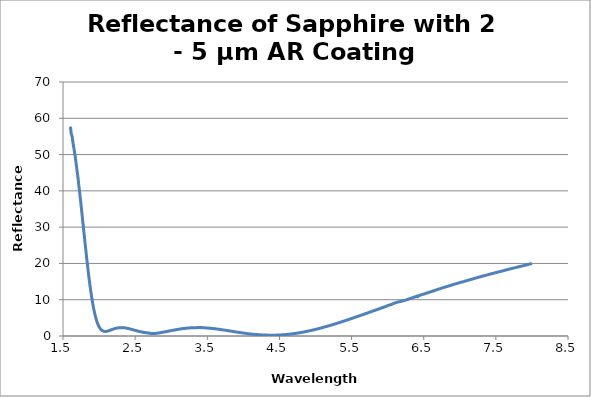
| Category | Wavelength (µm) |
|---|---|
| 1.59996 | 56.909 |
| 1.60243 | 57.18 |
| 1.6049 | 57.358 |
| 1.60737 | 57.055 |
| 1.6098299999999999 | 56.45 |
| 1.6122999999999998 | 55.977 |
| 1.61477 | 55.744 |
| 1.61724 | 55.648 |
| 1.61971 | 55.459 |
| 1.62218 | 55.185 |
| 1.6246500000000001 | 55.079 |
| 1.62712 | 54.979 |
| 1.6295899999999999 | 54.58 |
| 1.6320599999999998 | 54.035 |
| 1.63453 | 53.771 |
| 1.63699 | 53.499 |
| 1.6394600000000001 | 53.002 |
| 1.6419300000000001 | 52.737 |
| 1.6444 | 52.586 |
| 1.6468699999999998 | 52.194 |
| 1.64934 | 51.9 |
| 1.65181 | 51.78 |
| 1.65428 | 51.38 |
| 1.65675 | 51.048 |
| 1.65922 | 50.906 |
| 1.6616900000000001 | 50.435 |
| 1.66415 | 50.188 |
| 1.66662 | 49.839 |
| 1.66909 | 49.418 |
| 1.67156 | 49.194 |
| 1.67403 | 48.727 |
| 1.6765 | 48.442 |
| 1.67897 | 48.013 |
| 1.68144 | 47.566 |
| 1.68391 | 47.272 |
| 1.6863800000000002 | 46.767 |
| 1.68884 | 46.502 |
| 1.6913099999999999 | 45.95 |
| 1.69378 | 45.726 |
| 1.69625 | 45.232 |
| 1.69872 | 45.006 |
| 1.70119 | 44.568 |
| 1.7036600000000002 | 44.301 |
| 1.7061300000000001 | 43.843 |
| 1.7086 | 43.573 |
| 1.7110699999999999 | 42.997 |
| 1.71354 | 42.644 |
| 1.716 | 42.054 |
| 1.71847 | 41.696 |
| 1.7209400000000001 | 41.182 |
| 1.72341 | 40.89 |
| 1.72588 | 40.471 |
| 1.7283499999999998 | 40.095 |
| 1.73082 | 39.685 |
| 1.73329 | 39.126 |
| 1.73576 | 38.678 |
| 1.73823 | 38.157 |
| 1.7407000000000001 | 37.833 |
| 1.74316 | 37.442 |
| 1.74563 | 36.934 |
| 1.7481 | 36.497 |
| 1.75057 | 35.933 |
| 1.75304 | 35.502 |
| 1.75551 | 35.172 |
| 1.75798 | 34.663 |
| 1.76045 | 34.178 |
| 1.76292 | 33.683 |
| 1.76539 | 33.201 |
| 1.76786 | 32.811 |
| 1.77032 | 32.396 |
| 1.7727899999999999 | 31.805 |
| 1.77526 | 31.309 |
| 1.77773 | 30.978 |
| 1.7802 | 30.513 |
| 1.78267 | 29.933 |
| 1.7851400000000002 | 29.462 |
| 1.78761 | 29.068 |
| 1.79008 | 28.577 |
| 1.7925499999999999 | 28.061 |
| 1.79502 | 27.624 |
| 1.79748 | 27.235 |
| 1.79995 | 26.712 |
| 1.8024200000000001 | 26.183 |
| 1.80489 | 25.8 |
| 1.8073599999999999 | 25.354 |
| 1.8098299999999998 | 24.832 |
| 1.8123 | 24.385 |
| 1.81477 | 23.976 |
| 1.81724 | 23.485 |
| 1.81971 | 23.043 |
| 1.82217 | 22.636 |
| 1.82464 | 22.124 |
| 1.8271099999999998 | 21.599 |
| 1.82958 | 21.287 |
| 1.83205 | 20.795 |
| 1.83452 | 20.397 |
| 1.83699 | 19.951 |
| 1.83946 | 19.517 |
| 1.84193 | 19.106 |
| 1.8444 | 18.674 |
| 1.8468699999999998 | 18.252 |
| 1.84933 | 17.825 |
| 1.8518 | 17.454 |
| 1.85427 | 17.018 |
| 1.85674 | 16.674 |
| 1.85921 | 16.225 |
| 1.86168 | 15.824 |
| 1.8641500000000002 | 15.446 |
| 1.86662 | 15.011 |
| 1.86909 | 14.682 |
| 1.87156 | 14.287 |
| 1.8740299999999999 | 13.883 |
| 1.87649 | 13.599 |
| 1.87896 | 13.229 |
| 1.8814300000000002 | 12.883 |
| 1.8839000000000001 | 12.53 |
| 1.8863699999999999 | 12.196 |
| 1.8888399999999999 | 11.837 |
| 1.89131 | 11.502 |
| 1.89378 | 11.192 |
| 1.89625 | 10.864 |
| 1.89872 | 10.563 |
| 1.9011900000000002 | 10.237 |
| 1.90365 | 9.935 |
| 1.9061199999999998 | 9.638 |
| 1.90859 | 9.37 |
| 1.91106 | 9.069 |
| 1.91353 | 8.833 |
| 1.916 | 8.507 |
| 1.9184700000000001 | 8.26 |
| 1.92094 | 7.971 |
| 1.92341 | 7.751 |
| 1.92588 | 7.472 |
| 1.92834 | 7.259 |
| 1.93081 | 7.004 |
| 1.9332799999999999 | 6.778 |
| 1.93575 | 6.548 |
| 1.93822 | 6.343 |
| 1.94069 | 6.101 |
| 1.94316 | 5.903 |
| 1.9456300000000002 | 5.703 |
| 1.9481 | 5.5 |
| 1.95057 | 5.309 |
| 1.9530399999999999 | 5.127 |
| 1.9555 | 4.948 |
| 1.95797 | 4.775 |
| 1.96044 | 4.62 |
| 1.9629100000000002 | 4.44 |
| 1.9653800000000001 | 4.279 |
| 1.9678499999999999 | 4.135 |
| 1.9703199999999998 | 3.98 |
| 1.97279 | 3.84 |
| 1.97526 | 3.684 |
| 1.97773 | 3.566 |
| 1.9802 | 3.423 |
| 1.98266 | 3.324 |
| 1.98513 | 3.182 |
| 1.9875999999999998 | 3.082 |
| 1.99007 | 2.959 |
| 1.99254 | 2.856 |
| 1.99501 | 2.762 |
| 1.99748 | 2.662 |
| 1.9999500000000001 | 2.551 |
| 2.00242 | 2.482 |
| 2.00489 | 2.39 |
| 2.00736 | 2.306 |
| 2.00982 | 2.231 |
| 2.01229 | 2.171 |
| 2.01476 | 2.097 |
| 2.01723 | 2.026 |
| 2.0197 | 1.958 |
| 2.02217 | 1.907 |
| 2.02464 | 1.838 |
| 2.02711 | 1.792 |
| 2.0295799999999997 | 1.734 |
| 2.03205 | 1.692 |
| 2.03452 | 1.642 |
| 2.0369800000000002 | 1.598 |
| 2.03945 | 1.572 |
| 2.04192 | 1.519 |
| 2.04439 | 1.502 |
| 2.0468599999999997 | 1.459 |
| 2.04933 | 1.432 |
| 2.0518 | 1.416 |
| 2.05427 | 1.383 |
| 2.0567399999999996 | 1.372 |
| 2.05921 | 1.341 |
| 2.06167 | 1.327 |
| 2.06414 | 1.31 |
| 2.0666100000000003 | 1.302 |
| 2.06908 | 1.284 |
| 2.0715500000000002 | 1.282 |
| 2.07402 | 1.276 |
| 2.0764899999999997 | 1.265 |
| 2.07896 | 1.262 |
| 2.0814299999999997 | 1.261 |
| 2.0839000000000003 | 1.251 |
| 2.08637 | 1.259 |
| 2.0888299999999997 | 1.258 |
| 2.0913000000000004 | 1.264 |
| 2.09377 | 1.27 |
| 2.09624 | 1.265 |
| 2.09871 | 1.273 |
| 2.10118 | 1.286 |
| 2.10365 | 1.296 |
| 2.1061199999999998 | 1.297 |
| 2.10859 | 1.315 |
| 2.11106 | 1.314 |
| 2.1135300000000004 | 1.323 |
| 2.1159899999999996 | 1.343 |
| 2.1184600000000002 | 1.353 |
| 2.12093 | 1.367 |
| 2.1234 | 1.383 |
| 2.12587 | 1.398 |
| 2.12834 | 1.409 |
| 2.13081 | 1.424 |
| 2.13328 | 1.451 |
| 2.13575 | 1.462 |
| 2.13822 | 1.482 |
| 2.14069 | 1.488 |
| 2.14315 | 1.503 |
| 2.14562 | 1.527 |
| 2.1480900000000003 | 1.536 |
| 2.15056 | 1.559 |
| 2.15303 | 1.576 |
| 2.1555 | 1.592 |
| 2.1579699999999997 | 1.624 |
| 2.16044 | 1.646 |
| 2.1629099999999997 | 1.651 |
| 2.1653800000000003 | 1.66 |
| 2.16784 | 1.683 |
| 2.1703099999999997 | 1.709 |
| 2.1727800000000004 | 1.726 |
| 2.17525 | 1.74 |
| 2.17772 | 1.767 |
| 2.18019 | 1.778 |
| 2.18266 | 1.793 |
| 2.18513 | 1.821 |
| 2.1875999999999998 | 1.833 |
| 2.19007 | 1.852 |
| 2.19254 | 1.869 |
| 2.195 | 1.892 |
| 2.1974699999999996 | 1.893 |
| 2.1999400000000002 | 1.915 |
| 2.20241 | 1.931 |
| 2.20488 | 1.95 |
| 2.20735 | 1.974 |
| 2.20982 | 1.989 |
| 2.21229 | 1.999 |
| 2.21476 | 2.012 |
| 2.21723 | 2.028 |
| 2.2197 | 2.045 |
| 2.2221599999999997 | 2.059 |
| 2.2246300000000003 | 2.061 |
| 2.2271 | 2.085 |
| 2.2295700000000003 | 2.099 |
| 2.23204 | 2.109 |
| 2.23451 | 2.123 |
| 2.23698 | 2.137 |
| 2.2394499999999997 | 2.149 |
| 2.24192 | 2.168 |
| 2.2443899999999997 | 2.178 |
| 2.2468600000000003 | 2.177 |
| 2.24932 | 2.191 |
| 2.25179 | 2.2 |
| 2.2542600000000004 | 2.205 |
| 2.25673 | 2.219 |
| 2.2592 | 2.226 |
| 2.26167 | 2.237 |
| 2.26414 | 2.234 |
| 2.26661 | 2.251 |
| 2.2690799999999998 | 2.248 |
| 2.2715500000000004 | 2.27 |
| 2.27401 | 2.267 |
| 2.27648 | 2.281 |
| 2.27895 | 2.287 |
| 2.2814200000000002 | 2.28 |
| 2.28389 | 2.281 |
| 2.28636 | 2.296 |
| 2.28883 | 2.302 |
| 2.2913 | 2.301 |
| 2.29377 | 2.298 |
| 2.2962399999999996 | 2.299 |
| 2.2987100000000003 | 2.302 |
| 2.30117 | 2.304 |
| 2.3036399999999997 | 2.308 |
| 2.3061100000000003 | 2.309 |
| 2.30858 | 2.304 |
| 2.3110500000000003 | 2.308 |
| 2.31352 | 2.309 |
| 2.3159899999999998 | 2.302 |
| 2.31846 | 2.303 |
| 2.3209299999999997 | 2.301 |
| 2.3234 | 2.298 |
| 2.32587 | 2.302 |
| 2.32833 | 2.285 |
| 2.3308 | 2.305 |
| 2.33327 | 2.291 |
| 2.33574 | 2.284 |
| 2.33821 | 2.28 |
| 2.34068 | 2.275 |
| 2.34315 | 2.271 |
| 2.34562 | 2.261 |
| 2.34809 | 2.264 |
| 2.3505599999999998 | 2.256 |
| 2.3530300000000004 | 2.246 |
| 2.3554899999999996 | 2.247 |
| 2.35796 | 2.233 |
| 2.36043 | 2.222 |
| 2.3629000000000002 | 2.208 |
| 2.36537 | 2.211 |
| 2.36784 | 2.2 |
| 2.37031 | 2.199 |
| 2.37278 | 2.19 |
| 2.37525 | 2.182 |
| 2.3777199999999996 | 2.168 |
| 2.3801900000000002 | 2.16 |
| 2.38265 | 2.152 |
| 2.3851199999999997 | 2.146 |
| 2.3875900000000003 | 2.127 |
| 2.39006 | 2.125 |
| 2.3925300000000003 | 2.105 |
| 2.395 | 2.1 |
| 2.3974699999999998 | 2.092 |
| 2.39994 | 2.077 |
| 2.4024099999999997 | 2.078 |
| 2.40488 | 2.053 |
| 2.40734 | 2.051 |
| 2.40981 | 2.039 |
| 2.41228 | 2.025 |
| 2.41475 | 2.012 |
| 2.41722 | 2 |
| 2.41969 | 1.986 |
| 2.42216 | 1.98 |
| 2.42463 | 1.958 |
| 2.4271 | 1.951 |
| 2.42957 | 1.938 |
| 2.4320399999999998 | 1.926 |
| 2.4345 | 1.904 |
| 2.4369699999999996 | 1.898 |
| 2.4394400000000003 | 1.883 |
| 2.44191 | 1.873 |
| 2.44438 | 1.859 |
| 2.44685 | 1.846 |
| 2.44932 | 1.839 |
| 2.45179 | 1.822 |
| 2.45426 | 1.804 |
| 2.45673 | 1.795 |
| 2.4591999999999996 | 1.77 |
| 2.4616599999999997 | 1.765 |
| 2.46413 | 1.751 |
| 2.4666 | 1.731 |
| 2.4690700000000003 | 1.723 |
| 2.47154 | 1.71 |
| 2.4740100000000003 | 1.692 |
| 2.47648 | 1.678 |
| 2.4789499999999998 | 1.666 |
| 2.48142 | 1.653 |
| 2.4838899999999997 | 1.637 |
| 2.4863600000000003 | 1.622 |
| 2.48882 | 1.613 |
| 2.49129 | 1.6 |
| 2.4937600000000004 | 1.589 |
| 2.49623 | 1.573 |
| 2.4987 | 1.55 |
| 2.50117 | 1.545 |
| 2.50364 | 1.526 |
| 2.50611 | 1.518 |
| 2.50858 | 1.508 |
| 2.51105 | 1.494 |
| 2.51351 | 1.468 |
| 2.51598 | 1.468 |
| 2.5184499999999996 | 1.445 |
| 2.5209200000000003 | 1.438 |
| 2.52339 | 1.429 |
| 2.52586 | 1.419 |
| 2.52833 | 1.402 |
| 2.5308 | 1.379 |
| 2.53327 | 1.372 |
| 2.5357399999999997 | 1.365 |
| 2.53821 | 1.344 |
| 2.54067 | 1.329 |
| 2.5431399999999997 | 1.333 |
| 2.54561 | 1.306 |
| 2.54808 | 1.294 |
| 2.5505500000000003 | 1.295 |
| 2.55302 | 1.273 |
| 2.55549 | 1.254 |
| 2.55796 | 1.245 |
| 2.5604299999999998 | 1.253 |
| 2.5629 | 1.227 |
| 2.5653699999999997 | 1.208 |
| 2.56783 | 1.207 |
| 2.5703 | 1.195 |
| 2.57277 | 1.193 |
| 2.57524 | 1.159 |
| 2.57771 | 1.166 |
| 2.58018 | 1.159 |
| 2.58265 | 1.136 |
| 2.58512 | 1.108 |
| 2.58759 | 1.127 |
| 2.59006 | 1.104 |
| 2.59253 | 1.109 |
| 2.5949899999999997 | 1.116 |
| 2.59746 | 1.064 |
| 2.5999299999999996 | 1.065 |
| 2.6024000000000003 | 1.064 |
| 2.60487 | 1.065 |
| 2.60734 | 1.023 |
| 2.60981 | 1.038 |
| 2.61228 | 1.02 |
| 2.61475 | 1.006 |
| 2.6172199999999997 | 1.006 |
| 2.61969 | 1.017 |
| 2.62215 | 0.97 |
| 2.6246199999999997 | 0.982 |
| 2.62709 | 0.995 |
| 2.62956 | 1 |
| 2.6320300000000003 | 0.94 |
| 2.6345 | 0.948 |
| 2.63697 | 0.944 |
| 2.63944 | 0.941 |
| 2.6419099999999998 | 0.944 |
| 2.64438 | 0.928 |
| 2.64684 | 0.904 |
| 2.64931 | 0.914 |
| 2.65178 | 0.914 |
| 2.65425 | 0.887 |
| 2.65672 | 0.886 |
| 2.65919 | 0.908 |
| 2.66166 | 0.874 |
| 2.66413 | 0.88 |
| 2.6666 | 0.883 |
| 2.66907 | 0.865 |
| 2.67154 | 0.824 |
| 2.674 | 0.847 |
| 2.6764699999999997 | 0.85 |
| 2.67894 | 0.816 |
| 2.68141 | 0.812 |
| 2.6838800000000003 | 0.828 |
| 2.68635 | 0.817 |
| 2.68882 | 0.797 |
| 2.69129 | 0.796 |
| 2.69376 | 0.809 |
| 2.69623 | 0.763 |
| 2.6986999999999997 | 0.763 |
| 2.70116 | 0.76 |
| 2.70363 | 0.744 |
| 2.7060999999999997 | 0.744 |
| 2.7085700000000004 | 0.746 |
| 2.71104 | 0.735 |
| 2.7135100000000003 | 0.719 |
| 2.71598 | 0.716 |
| 2.71845 | 0.714 |
| 2.72092 | 0.719 |
| 2.7233899999999998 | 0.707 |
| 2.72586 | 0.697 |
| 2.72832 | 0.693 |
| 2.73079 | 0.704 |
| 2.73326 | 0.697 |
| 2.73573 | 0.684 |
| 2.7382 | 0.698 |
| 2.74067 | 0.68 |
| 2.74314 | 0.679 |
| 2.74561 | 0.687 |
| 2.74808 | 0.678 |
| 2.75055 | 0.681 |
| 2.75301 | 0.679 |
| 2.75548 | 0.698 |
| 2.7579499999999997 | 0.68 |
| 2.76042 | 0.689 |
| 2.76289 | 0.698 |
| 2.7653600000000003 | 0.695 |
| 2.76783 | 0.7 |
| 2.7703 | 0.703 |
| 2.77277 | 0.699 |
| 2.7752399999999997 | 0.702 |
| 2.77771 | 0.705 |
| 2.78017 | 0.721 |
| 2.78264 | 0.718 |
| 2.78511 | 0.727 |
| 2.7875799999999997 | 0.735 |
| 2.7900500000000004 | 0.733 |
| 2.79252 | 0.736 |
| 2.79499 | 0.747 |
| 2.79746 | 0.75 |
| 2.79993 | 0.758 |
| 2.8024 | 0.77 |
| 2.8048699999999998 | 0.767 |
| 2.80733 | 0.784 |
| 2.8098 | 0.781 |
| 2.81227 | 0.788 |
| 2.8147399999999996 | 0.797 |
| 2.81721 | 0.8 |
| 2.81968 | 0.814 |
| 2.82215 | 0.816 |
| 2.82462 | 0.827 |
| 2.82709 | 0.83 |
| 2.82956 | 0.842 |
| 2.83203 | 0.846 |
| 2.8344899999999997 | 0.85 |
| 2.83696 | 0.871 |
| 2.8394299999999997 | 0.878 |
| 2.8419 | 0.878 |
| 2.84437 | 0.899 |
| 2.8468400000000003 | 0.902 |
| 2.84931 | 0.905 |
| 2.85178 | 0.919 |
| 2.85425 | 0.931 |
| 2.8567199999999997 | 0.936 |
| 2.85918 | 0.939 |
| 2.86165 | 0.96 |
| 2.8641199999999998 | 0.959 |
| 2.86659 | 0.975 |
| 2.86906 | 0.975 |
| 2.8715300000000004 | 0.985 |
| 2.874 | 0.993 |
| 2.87647 | 1.009 |
| 2.87894 | 1.018 |
| 2.88141 | 1.023 |
| 2.88388 | 1.041 |
| 2.88634 | 1.036 |
| 2.88881 | 1.048 |
| 2.89128 | 1.065 |
| 2.89375 | 1.07 |
| 2.89622 | 1.079 |
| 2.89869 | 1.085 |
| 2.90116 | 1.091 |
| 2.90363 | 1.095 |
| 2.9061 | 1.123 |
| 2.90857 | 1.124 |
| 2.91104 | 1.137 |
| 2.9135 | 1.15 |
| 2.9159699999999997 | 1.155 |
| 2.91844 | 1.163 |
| 2.9209099999999997 | 1.171 |
| 2.9233800000000003 | 1.181 |
| 2.92585 | 1.189 |
| 2.9283200000000003 | 1.207 |
| 2.93079 | 1.21 |
| 2.93326 | 1.224 |
| 2.93573 | 1.232 |
| 2.9381999999999997 | 1.246 |
| 2.94066 | 1.255 |
| 2.94313 | 1.267 |
| 2.9455999999999998 | 1.269 |
| 2.94807 | 1.281 |
| 2.95054 | 1.294 |
| 2.9530100000000004 | 1.299 |
| 2.95548 | 1.312 |
| 2.95795 | 1.317 |
| 2.96042 | 1.333 |
| 2.96289 | 1.346 |
| 2.96536 | 1.352 |
| 2.96782 | 1.362 |
| 2.97029 | 1.368 |
| 2.97276 | 1.378 |
| 2.97523 | 1.394 |
| 2.9777 | 1.405 |
| 2.98017 | 1.41 |
| 2.98264 | 1.423 |
| 2.98511 | 1.43 |
| 2.98758 | 1.44 |
| 2.99005 | 1.453 |
| 2.9925100000000002 | 1.458 |
| 2.99498 | 1.47 |
| 2.9974499999999997 | 1.479 |
| 2.99992 | 1.487 |
| 3.0023899999999997 | 1.497 |
| 3.0048600000000003 | 1.51 |
| 3.00733 | 1.517 |
| 3.0098000000000003 | 1.527 |
| 3.01227 | 1.533 |
| 3.0147399999999998 | 1.545 |
| 3.01721 | 1.555 |
| 3.01967 | 1.567 |
| 3.02214 | 1.568 |
| 3.02461 | 1.58 |
| 3.0270799999999998 | 1.595 |
| 3.02955 | 1.602 |
| 3.03202 | 1.611 |
| 3.03449 | 1.618 |
| 3.03696 | 1.626 |
| 3.03943 | 1.64 |
| 3.0419 | 1.644 |
| 3.04437 | 1.652 |
| 3.04683 | 1.662 |
| 3.0493 | 1.67 |
| 3.05177 | 1.676 |
| 3.0542399999999996 | 1.678 |
| 3.05671 | 1.695 |
| 3.05918 | 1.708 |
| 3.06165 | 1.713 |
| 3.06412 | 1.729 |
| 3.06659 | 1.738 |
| 3.06906 | 1.743 |
| 3.07153 | 1.748 |
| 3.07399 | 1.76 |
| 3.07646 | 1.767 |
| 3.0789299999999997 | 1.772 |
| 3.0814 | 1.787 |
| 3.08387 | 1.791 |
| 3.0863400000000003 | 1.8 |
| 3.08881 | 1.801 |
| 3.0912800000000002 | 1.81 |
| 3.09375 | 1.831 |
| 3.0962199999999998 | 1.826 |
| 3.09868 | 1.839 |
| 3.10115 | 1.853 |
| 3.10362 | 1.859 |
| 3.10609 | 1.87 |
| 3.1085599999999998 | 1.877 |
| 3.1110300000000004 | 1.882 |
| 3.1135 | 1.891 |
| 3.11597 | 1.905 |
| 3.11844 | 1.904 |
| 3.12091 | 1.913 |
| 3.12338 | 1.928 |
| 3.12584 | 1.924 |
| 3.12831 | 1.939 |
| 3.13078 | 1.946 |
| 3.13325 | 1.955 |
| 3.1357199999999996 | 1.967 |
| 3.1381900000000003 | 1.97 |
| 3.14066 | 1.983 |
| 3.14313 | 1.983 |
| 3.1456 | 1.995 |
| 3.14807 | 1.994 |
| 3.15054 | 2.006 |
| 3.153 | 2.008 |
| 3.1554699999999998 | 2.015 |
| 3.15794 | 2.026 |
| 3.1604099999999997 | 2.032 |
| 3.16288 | 2.037 |
| 3.16535 | 2.039 |
| 3.1678200000000003 | 2.058 |
| 3.17029 | 2.055 |
| 3.1727600000000002 | 2.063 |
| 3.17523 | 2.071 |
| 3.1776999999999997 | 2.079 |
| 3.18016 | 2.083 |
| 3.18263 | 2.085 |
| 3.1851 | 2.091 |
| 3.18757 | 2.102 |
| 3.1900399999999998 | 2.111 |
| 3.1925100000000004 | 2.112 |
| 3.19498 | 2.12 |
| 3.19745 | 2.119 |
| 3.19992 | 2.128 |
| 3.20239 | 2.133 |
| 3.20485 | 2.147 |
| 3.20732 | 2.137 |
| 3.20979 | 2.148 |
| 3.21226 | 2.156 |
| 3.21473 | 2.162 |
| 3.2171999999999996 | 2.166 |
| 3.2196700000000003 | 2.164 |
| 3.22214 | 2.176 |
| 3.22461 | 2.18 |
| 3.22708 | 2.188 |
| 3.22955 | 2.184 |
| 3.2320100000000003 | 2.191 |
| 3.23448 | 2.193 |
| 3.2369499999999998 | 2.207 |
| 3.23942 | 2.201 |
| 3.2418899999999997 | 2.206 |
| 3.24436 | 2.213 |
| 3.24683 | 2.216 |
| 3.2493000000000003 | 2.22 |
| 3.25177 | 2.223 |
| 3.25424 | 2.23 |
| 3.25671 | 2.228 |
| 3.25917 | 2.235 |
| 3.26164 | 2.232 |
| 3.26411 | 2.243 |
| 3.26658 | 2.246 |
| 3.26905 | 2.252 |
| 3.2715199999999998 | 2.25 |
| 3.27399 | 2.261 |
| 3.27646 | 2.26 |
| 3.27893 | 2.262 |
| 3.2814 | 2.26 |
| 3.28387 | 2.265 |
| 3.28633 | 2.258 |
| 3.2888 | 2.269 |
| 3.29127 | 2.274 |
| 3.2937399999999997 | 2.272 |
| 3.29621 | 2.275 |
| 3.29868 | 2.286 |
| 3.3011500000000003 | 2.277 |
| 3.30362 | 2.28 |
| 3.30609 | 2.285 |
| 3.30856 | 2.29 |
| 3.31103 | 2.286 |
| 3.31349 | 2.295 |
| 3.31596 | 2.288 |
| 3.3184299999999998 | 2.29 |
| 3.3209 | 2.294 |
| 3.3233699999999997 | 2.299 |
| 3.3258400000000004 | 2.297 |
| 3.32831 | 2.306 |
| 3.3307800000000003 | 2.302 |
| 3.33325 | 2.305 |
| 3.33572 | 2.301 |
| 3.33818 | 2.303 |
| 3.34065 | 2.304 |
| 3.34312 | 2.307 |
| 3.34559 | 2.305 |
| 3.34806 | 2.311 |
| 3.35053 | 2.308 |
| 3.353 | 2.303 |
| 3.35547 | 2.304 |
| 3.35794 | 2.309 |
| 3.36041 | 2.3 |
| 3.36288 | 2.312 |
| 3.36534 | 2.311 |
| 3.36781 | 2.315 |
| 3.37028 | 2.315 |
| 3.37275 | 2.314 |
| 3.3752199999999997 | 2.309 |
| 3.37769 | 2.316 |
| 3.38016 | 2.314 |
| 3.3826300000000002 | 2.313 |
| 3.3851 | 2.312 |
| 3.38757 | 2.314 |
| 3.39004 | 2.318 |
| 3.3925 | 2.314 |
| 3.39497 | 2.311 |
| 3.39744 | 2.309 |
| 3.3999099999999998 | 2.304 |
| 3.40238 | 2.312 |
| 3.4048499999999997 | 2.3 |
| 3.4073200000000003 | 2.315 |
| 3.40979 | 2.312 |
| 3.4122600000000003 | 2.313 |
| 3.41473 | 2.318 |
| 3.4172 | 2.316 |
| 3.41966 | 2.316 |
| 3.42213 | 2.321 |
| 3.4246 | 2.318 |
| 3.42707 | 2.307 |
| 3.42954 | 2.314 |
| 3.43201 | 2.305 |
| 3.43448 | 2.3 |
| 3.43695 | 2.296 |
| 3.43942 | 2.297 |
| 3.44189 | 2.284 |
| 3.44435 | 2.282 |
| 3.44682 | 2.279 |
| 3.44929 | 2.278 |
| 3.45176 | 2.267 |
| 3.45423 | 2.265 |
| 3.4566999999999997 | 2.266 |
| 3.45917 | 2.258 |
| 3.46164 | 2.255 |
| 3.4641100000000002 | 2.252 |
| 3.46658 | 2.253 |
| 3.46905 | 2.249 |
| 3.4715100000000003 | 2.246 |
| 3.47398 | 2.243 |
| 3.47645 | 2.243 |
| 3.47892 | 2.235 |
| 3.4813899999999998 | 2.236 |
| 3.48386 | 2.23 |
| 3.4863299999999997 | 2.226 |
| 3.4888000000000003 | 2.22 |
| 3.49127 | 2.217 |
| 3.49374 | 2.218 |
| 3.49621 | 2.213 |
| 3.49867 | 2.214 |
| 3.50114 | 2.207 |
| 3.50361 | 2.211 |
| 3.50608 | 2.211 |
| 3.50855 | 2.206 |
| 3.51102 | 2.194 |
| 3.51349 | 2.19 |
| 3.51596 | 2.184 |
| 3.51843 | 2.182 |
| 3.5209 | 2.18 |
| 3.52337 | 2.168 |
| 3.52583 | 2.165 |
| 3.5283 | 2.157 |
| 3.53077 | 2.152 |
| 3.5332399999999997 | 2.149 |
| 3.53571 | 2.147 |
| 3.5381799999999997 | 2.139 |
| 3.5406500000000003 | 2.129 |
| 3.54312 | 2.129 |
| 3.5455900000000002 | 2.125 |
| 3.54806 | 2.119 |
| 3.55053 | 2.113 |
| 3.55299 | 2.107 |
| 3.55546 | 2.101 |
| 3.55793 | 2.103 |
| 3.5604 | 2.1 |
| 3.5628699999999998 | 2.092 |
| 3.56534 | 2.088 |
| 3.56781 | 2.081 |
| 3.5702800000000003 | 2.076 |
| 3.57275 | 2.067 |
| 3.57522 | 2.065 |
| 3.57768 | 2.062 |
| 3.58015 | 2.055 |
| 3.58262 | 2.046 |
| 3.58509 | 2.04 |
| 3.58756 | 2.037 |
| 3.59003 | 2.03 |
| 3.5925 | 2.026 |
| 3.59497 | 2.022 |
| 3.59744 | 2.017 |
| 3.59991 | 2.008 |
| 3.60238 | 2 |
| 3.6048400000000003 | 1.991 |
| 3.60731 | 1.982 |
| 3.60978 | 1.979 |
| 3.61225 | 1.976 |
| 3.6147199999999997 | 1.972 |
| 3.61719 | 1.964 |
| 3.6196599999999997 | 1.956 |
| 3.6221300000000003 | 1.951 |
| 3.6246 | 1.941 |
| 3.6270700000000002 | 1.937 |
| 3.62954 | 1.93 |
| 3.632 | 1.923 |
| 3.63447 | 1.918 |
| 3.63694 | 1.904 |
| 3.63941 | 1.907 |
| 3.64188 | 1.9 |
| 3.6443499999999998 | 1.891 |
| 3.64682 | 1.888 |
| 3.64929 | 1.878 |
| 3.6517600000000003 | 1.871 |
| 3.65423 | 1.862 |
| 3.6567 | 1.871 |
| 3.65916 | 1.854 |
| 3.66163 | 1.842 |
| 3.6641 | 1.838 |
| 3.66657 | 1.831 |
| 3.66904 | 1.828 |
| 3.67151 | 1.816 |
| 3.67398 | 1.81 |
| 3.67645 | 1.805 |
| 3.67892 | 1.795 |
| 3.68139 | 1.787 |
| 3.68385 | 1.782 |
| 3.6863200000000003 | 1.776 |
| 3.68879 | 1.769 |
| 3.69126 | 1.762 |
| 3.69373 | 1.757 |
| 3.6961999999999997 | 1.749 |
| 3.69867 | 1.743 |
| 3.7011399999999997 | 1.73 |
| 3.7036100000000003 | 1.728 |
| 3.70608 | 1.718 |
| 3.7085500000000002 | 1.711 |
| 3.7110100000000004 | 1.712 |
| 3.71348 | 1.699 |
| 3.71595 | 1.69 |
| 3.71842 | 1.68 |
| 3.72089 | 1.667 |
| 3.72336 | 1.666 |
| 3.7258299999999998 | 1.667 |
| 3.7283000000000004 | 1.652 |
| 3.73077 | 1.644 |
| 3.73324 | 1.633 |
| 3.73571 | 1.632 |
| 3.73817 | 1.623 |
| 3.74064 | 1.619 |
| 3.74311 | 1.609 |
| 3.74558 | 1.6 |
| 3.74805 | 1.601 |
| 3.75052 | 1.596 |
| 3.7529899999999996 | 1.58 |
| 3.7554600000000002 | 1.573 |
| 3.75793 | 1.562 |
| 3.7604 | 1.551 |
| 3.76287 | 1.549 |
| 3.76533 | 1.545 |
| 3.7678000000000003 | 1.539 |
| 3.77027 | 1.524 |
| 3.7727399999999998 | 1.516 |
| 3.77521 | 1.513 |
| 3.7776799999999997 | 1.505 |
| 3.78015 | 1.495 |
| 3.78262 | 1.484 |
| 3.7850900000000003 | 1.474 |
| 3.78756 | 1.469 |
| 3.79002 | 1.466 |
| 3.79249 | 1.46 |
| 3.79496 | 1.447 |
| 3.79743 | 1.439 |
| 3.7999 | 1.433 |
| 3.80237 | 1.421 |
| 3.80484 | 1.417 |
| 3.8073099999999998 | 1.415 |
| 3.8097800000000004 | 1.398 |
| 3.81225 | 1.393 |
| 3.81472 | 1.386 |
| 3.81718 | 1.377 |
| 3.81965 | 1.37 |
| 3.82212 | 1.364 |
| 3.82459 | 1.358 |
| 3.82706 | 1.347 |
| 3.82953 | 1.34 |
| 3.832 | 1.332 |
| 3.8344699999999996 | 1.322 |
| 3.8369400000000002 | 1.316 |
| 3.83941 | 1.309 |
| 3.84188 | 1.3 |
| 3.8443400000000003 | 1.296 |
| 3.84681 | 1.281 |
| 3.8492800000000003 | 1.276 |
| 3.85175 | 1.272 |
| 3.8542199999999998 | 1.261 |
| 3.85669 | 1.252 |
| 3.8591599999999997 | 1.243 |
| 3.86163 | 1.232 |
| 3.8641 | 1.233 |
| 3.8665700000000003 | 1.218 |
| 3.86904 | 1.208 |
| 3.8715 | 1.207 |
| 3.87397 | 1.198 |
| 3.87644 | 1.186 |
| 3.87891 | 1.182 |
| 3.88138 | 1.172 |
| 3.88385 | 1.164 |
| 3.88632 | 1.156 |
| 3.8887899999999997 | 1.15 |
| 3.8912600000000004 | 1.142 |
| 3.89373 | 1.132 |
| 3.8962 | 1.118 |
| 3.89866 | 1.114 |
| 3.90113 | 1.107 |
| 3.9036 | 1.103 |
| 3.90607 | 1.095 |
| 3.90854 | 1.085 |
| 3.91101 | 1.079 |
| 3.91348 | 1.073 |
| 3.9159499999999996 | 1.06 |
| 3.9184200000000002 | 1.052 |
| 3.92089 | 1.044 |
| 3.92335 | 1.038 |
| 3.9258200000000003 | 1.034 |
| 3.92829 | 1.021 |
| 3.9307600000000003 | 1.014 |
| 3.93323 | 1.009 |
| 3.9356999999999998 | 1.003 |
| 3.93817 | 0.996 |
| 3.9406399999999997 | 0.988 |
| 3.9431100000000003 | 0.978 |
| 3.94558 | 0.975 |
| 3.9480500000000003 | 0.964 |
| 3.9505100000000004 | 0.956 |
| 3.95298 | 0.952 |
| 3.95545 | 0.945 |
| 3.95792 | 0.934 |
| 3.96039 | 0.927 |
| 3.96286 | 0.919 |
| 3.96533 | 0.911 |
| 3.9678 | 0.903 |
| 3.97027 | 0.895 |
| 3.97274 | 0.889 |
| 3.97521 | 0.879 |
| 3.9776700000000003 | 0.871 |
| 3.98014 | 0.87 |
| 3.98261 | 0.861 |
| 3.98508 | 0.849 |
| 3.98755 | 0.846 |
| 3.99002 | 0.84 |
| 3.9924899999999997 | 0.831 |
| 3.99496 | 0.828 |
| 3.99743 | 0.819 |
| 3.9999000000000002 | 0.812 |
| 4.00237 | 0.804 |
| 4.00483 | 0.796 |
| 4.0073 | 0.787 |
| 4.00977 | 0.786 |
| 4.012239999999999 | 0.779 |
| 4.01471 | 0.774 |
| 4.01718 | 0.77 |
| 4.01965 | 0.76 |
| 4.02212 | 0.75 |
| 4.02459 | 0.746 |
| 4.02706 | 0.742 |
| 4.02952 | 0.736 |
| 4.0319899999999995 | 0.727 |
| 4.03446 | 0.721 |
| 4.03693 | 0.714 |
| 4.0394 | 0.705 |
| 4.04187 | 0.695 |
| 4.04434 | 0.693 |
| 4.04681 | 0.684 |
| 4.04928 | 0.675 |
| 4.05175 | 0.669 |
| 4.05422 | 0.668 |
| 4.05668 | 0.66 |
| 4.05915 | 0.654 |
| 4.06162 | 0.647 |
| 4.06409 | 0.64 |
| 4.06656 | 0.634 |
| 4.069030000000001 | 0.629 |
| 4.0715 | 0.623 |
| 4.07397 | 0.616 |
| 4.07644 | 0.608 |
| 4.07891 | 0.611 |
| 4.08138 | 0.606 |
| 4.08384 | 0.595 |
| 4.08631 | 0.583 |
| 4.08878 | 0.586 |
| 4.09125 | 0.577 |
| 4.093719999999999 | 0.568 |
| 4.09619 | 0.565 |
| 4.09866 | 0.559 |
| 4.10113 | 0.553 |
| 4.1036 | 0.548 |
| 4.10607 | 0.544 |
| 4.10854 | 0.534 |
| 4.111 | 0.533 |
| 4.11347 | 0.528 |
| 4.115939999999999 | 0.521 |
| 4.11841 | 0.517 |
| 4.1208800000000005 | 0.511 |
| 4.12335 | 0.507 |
| 4.12582 | 0.505 |
| 4.12829 | 0.502 |
| 4.13076 | 0.493 |
| 4.133229999999999 | 0.486 |
| 4.135689999999999 | 0.482 |
| 4.13816 | 0.475 |
| 4.14063 | 0.471 |
| 4.1431000000000004 | 0.466 |
| 4.145569999999999 | 0.46 |
| 4.14804 | 0.457 |
| 4.150510000000001 | 0.453 |
| 4.1529799999999994 | 0.449 |
| 4.15545 | 0.445 |
| 4.15792 | 0.442 |
| 4.1603900000000005 | 0.435 |
| 4.162850000000001 | 0.43 |
| 4.1653199999999995 | 0.429 |
| 4.16779 | 0.422 |
| 4.17026 | 0.415 |
| 4.17273 | 0.409 |
| 4.1752 | 0.403 |
| 4.17767 | 0.401 |
| 4.180140000000001 | 0.399 |
| 4.1826099999999995 | 0.396 |
| 4.18508 | 0.389 |
| 4.18755 | 0.387 |
| 4.19001 | 0.384 |
| 4.19248 | 0.38 |
| 4.1949499999999995 | 0.378 |
| 4.19742 | 0.376 |
| 4.19989 | 0.374 |
| 4.20236 | 0.371 |
| 4.20483 | 0.367 |
| 4.2073 | 0.364 |
| 4.209770000000001 | 0.362 |
| 4.2122399999999995 | 0.361 |
| 4.21471 | 0.366 |
| 4.21717 | 0.37 |
| 4.21964 | 0.368 |
| 4.22211 | 0.343 |
| 4.22458 | 0.354 |
| 4.22705 | 0.367 |
| 4.229520000000001 | 0.364 |
| 4.23199 | 0.357 |
| 4.23446 | 0.353 |
| 4.23693 | 0.348 |
| 4.2394 | 0.324 |
| 4.24187 | 0.325 |
| 4.24433 | 0.326 |
| 4.2468 | 0.311 |
| 4.24927 | 0.323 |
| 4.25174 | 0.316 |
| 4.25421 | 0.294 |
| 4.25668 | 0.292 |
| 4.25915 | 0.299 |
| 4.26162 | 0.304 |
| 4.26409 | 0.298 |
| 4.26656 | 0.305 |
| 4.26902 | 0.302 |
| 4.27149 | 0.288 |
| 4.27396 | 0.3 |
| 4.27643 | 0.304 |
| 4.278899999999999 | 0.302 |
| 4.28137 | 0.298 |
| 4.2838400000000005 | 0.288 |
| 4.28631 | 0.277 |
| 4.28878 | 0.269 |
| 4.29125 | 0.272 |
| 4.29372 | 0.266 |
| 4.2961800000000006 | 0.247 |
| 4.298649999999999 | 0.266 |
| 4.30112 | 0.273 |
| 4.30359 | 0.27 |
| 4.30606 | 0.264 |
| 4.308529999999999 | 0.262 |
| 4.311 | 0.259 |
| 4.313470000000001 | 0.249 |
| 4.315939999999999 | 0.248 |
| 4.31841 | 0.248 |
| 4.32088 | 0.249 |
| 4.32334 | 0.252 |
| 4.325810000000001 | 0.249 |
| 4.3282799999999995 | 0.236 |
| 4.33075 | 0.235 |
| 4.33322 | 0.233 |
| 4.33569 | 0.231 |
| 4.33816 | 0.231 |
| 4.34063 | 0.233 |
| 4.343100000000001 | 0.237 |
| 4.3455699999999995 | 0.231 |
| 4.34804 | 0.231 |
| 4.3505 | 0.233 |
| 4.35297 | 0.226 |
| 4.35544 | 0.223 |
| 4.3579099999999995 | 0.223 |
| 4.36038 | 0.226 |
| 4.362850000000001 | 0.227 |
| 4.36532 | 0.227 |
| 4.36779 | 0.227 |
| 4.37026 | 0.227 |
| 4.37273 | 0.226 |
| 4.37519 | 0.225 |
| 4.37766 | 0.221 |
| 4.38013 | 0.218 |
| 4.3826 | 0.223 |
| 4.38507 | 0.222 |
| 4.3875399999999996 | 0.218 |
| 4.39001 | 0.218 |
| 4.39248 | 0.221 |
| 4.39495 | 0.223 |
| 4.39742 | 0.217 |
| 4.39989 | 0.219 |
| 4.40235 | 0.224 |
| 4.40482 | 0.227 |
| 4.40729 | 0.229 |
| 4.40976 | 0.231 |
| 4.412229999999999 | 0.227 |
| 4.4147 | 0.227 |
| 4.4171700000000005 | 0.229 |
| 4.41964 | 0.231 |
| 4.42211 | 0.229 |
| 4.42458 | 0.227 |
| 4.42705 | 0.23 |
| 4.4295100000000005 | 0.233 |
| 4.431979999999999 | 0.235 |
| 4.43445 | 0.234 |
| 4.43692 | 0.233 |
| 4.43939 | 0.232 |
| 4.441859999999999 | 0.237 |
| 4.44433 | 0.239 |
| 4.4468000000000005 | 0.235 |
| 4.44927 | 0.238 |
| 4.45174 | 0.242 |
| 4.45421 | 0.245 |
| 4.45667 | 0.247 |
| 4.4591400000000005 | 0.248 |
| 4.461609999999999 | 0.252 |
| 4.46408 | 0.252 |
| 4.46655 | 0.249 |
| 4.46902 | 0.255 |
| 4.47149 | 0.257 |
| 4.47396 | 0.257 |
| 4.476430000000001 | 0.26 |
| 4.478899999999999 | 0.263 |
| 4.48137 | 0.267 |
| 4.48383 | 0.268 |
| 4.4863 | 0.268 |
| 4.488770000000001 | 0.272 |
| 4.4912399999999995 | 0.273 |
| 4.49371 | 0.272 |
| 4.496180000000001 | 0.272 |
| 4.49865 | 0.273 |
| 4.50112 | 0.275 |
| 4.50359 | 0.286 |
| 4.506060000000001 | 0.294 |
| 4.508520000000001 | 0.294 |
| 4.51099 | 0.294 |
| 4.51346 | 0.294 |
| 4.51593 | 0.301 |
| 4.5184 | 0.303 |
| 4.5208699999999995 | 0.303 |
| 4.52334 | 0.309 |
| 4.525810000000001 | 0.313 |
| 4.52828 | 0.316 |
| 4.53075 | 0.319 |
| 4.53322 | 0.323 |
| 4.53568 | 0.323 |
| 4.53815 | 0.327 |
| 4.54062 | 0.332 |
| 4.54309 | 0.335 |
| 4.54556 | 0.336 |
| 4.54803 | 0.337 |
| 4.5505 | 0.343 |
| 4.55297 | 0.349 |
| 4.55544 | 0.347 |
| 4.55791 | 0.349 |
| 4.56038 | 0.356 |
| 4.5628400000000005 | 0.36 |
| 4.56531 | 0.364 |
| 4.56778 | 0.369 |
| 4.57025 | 0.374 |
| 4.57272 | 0.378 |
| 4.575189999999999 | 0.384 |
| 4.57766 | 0.388 |
| 4.5801300000000005 | 0.392 |
| 4.5826 | 0.392 |
| 4.58507 | 0.393 |
| 4.58754 | 0.406 |
| 4.59 | 0.413 |
| 4.5924700000000005 | 0.413 |
| 4.594939999999999 | 0.419 |
| 4.59741 | 0.426 |
| 4.59988 | 0.432 |
| 4.60235 | 0.436 |
| 4.60482 | 0.436 |
| 4.60729 | 0.442 |
| 4.6097600000000005 | 0.448 |
| 4.612229999999999 | 0.45 |
| 4.6146899999999995 | 0.454 |
| 4.61716 | 0.46 |
| 4.61963 | 0.462 |
| 4.6221000000000005 | 0.464 |
| 4.624569999999999 | 0.475 |
| 4.62704 | 0.483 |
| 4.62951 | 0.488 |
| 4.6319799999999995 | 0.492 |
| 4.63445 | 0.497 |
| 4.63692 | 0.505 |
| 4.639390000000001 | 0.51 |
| 4.641850000000001 | 0.51 |
| 4.64432 | 0.518 |
| 4.64679 | 0.526 |
| 4.64926 | 0.531 |
| 4.65173 | 0.537 |
| 4.6541999999999994 | 0.545 |
| 4.65667 | 0.548 |
| 4.659140000000001 | 0.55 |
| 4.66161 | 0.555 |
| 4.66408 | 0.561 |
| 4.66655 | 0.569 |
| 4.66901 | 0.577 |
| 4.67148 | 0.585 |
| 4.67395 | 0.591 |
| 4.67642 | 0.596 |
| 4.67889 | 0.597 |
| 4.68136 | 0.605 |
| 4.6838299999999995 | 0.619 |
| 4.6863 | 0.624 |
| 4.688770000000001 | 0.627 |
| 4.69124 | 0.634 |
| 4.69371 | 0.64 |
| 4.69617 | 0.644 |
| 4.69864 | 0.649 |
| 4.70111 | 0.655 |
| 4.70358 | 0.669 |
| 4.70605 | 0.68 |
| 4.70852 | 0.682 |
| 4.71099 | 0.688 |
| 4.71346 | 0.698 |
| 4.71593 | 0.704 |
| 4.7184 | 0.709 |
| 4.72086 | 0.715 |
| 4.72333 | 0.72 |
| 4.7258000000000004 | 0.726 |
| 4.72827 | 0.735 |
| 4.73074 | 0.747 |
| 4.73321 | 0.757 |
| 4.73568 | 0.767 |
| 4.738149999999999 | 0.767 |
| 4.74062 | 0.771 |
| 4.7430900000000005 | 0.782 |
| 4.74556 | 0.788 |
| 4.74802 | 0.791 |
| 4.75049 | 0.798 |
| 4.75296 | 0.807 |
| 4.7554300000000005 | 0.816 |
| 4.757899999999999 | 0.825 |
| 4.76037 | 0.836 |
| 4.76284 | 0.846 |
| 4.76531 | 0.853 |
| 4.76778 | 0.856 |
| 4.77025 | 0.857 |
| 4.7727200000000005 | 0.87 |
| 4.775180000000001 | 0.883 |
| 4.7776499999999995 | 0.889 |
| 4.78012 | 0.896 |
| 4.78259 | 0.906 |
| 4.7850600000000005 | 0.915 |
| 4.787529999999999 | 0.923 |
| 4.79 | 0.933 |
| 4.792470000000001 | 0.943 |
| 4.7949399999999995 | 0.954 |
| 4.79741 | 0.964 |
| 4.79988 | 0.97 |
| 4.80234 | 0.979 |
| 4.804810000000001 | 0.99 |
| 4.8072799999999996 | 0.998 |
| 4.80975 | 1.002 |
| 4.81222 | 1.01 |
| 4.81469 | 1.019 |
| 4.817159999999999 | 1.027 |
| 4.81963 | 1.035 |
| 4.822100000000001 | 1.045 |
| 4.82457 | 1.054 |
| 4.82704 | 1.063 |
| 4.8295 | 1.074 |
| 4.83197 | 1.087 |
| 4.83444 | 1.098 |
| 4.83691 | 1.107 |
| 4.83938 | 1.112 |
| 4.84185 | 1.116 |
| 4.84432 | 1.132 |
| 4.84679 | 1.145 |
| 4.84926 | 1.152 |
| 4.85173 | 1.16 |
| 4.85419 | 1.17 |
| 4.85666 | 1.179 |
| 4.85913 | 1.188 |
| 4.8616 | 1.198 |
| 4.86407 | 1.209 |
| 4.86654 | 1.22 |
| 4.86901 | 1.231 |
| 4.871479999999999 | 1.239 |
| 4.87395 | 1.249 |
| 4.87642 | 1.264 |
| 4.87889 | 1.276 |
| 4.88135 | 1.281 |
| 4.88382 | 1.288 |
| 4.88629 | 1.299 |
| 4.88876 | 1.31 |
| 4.891229999999999 | 1.321 |
| 4.8937 | 1.332 |
| 4.89617 | 1.343 |
| 4.89864 | 1.352 |
| 4.90111 | 1.362 |
| 4.90358 | 1.373 |
| 4.9060500000000005 | 1.385 |
| 4.908510000000001 | 1.398 |
| 4.9109799999999995 | 1.409 |
| 4.91345 | 1.414 |
| 4.91592 | 1.422 |
| 4.9183900000000005 | 1.437 |
| 4.920859999999999 | 1.449 |
| 4.92333 | 1.458 |
| 4.925800000000001 | 1.469 |
| 4.92827 | 1.483 |
| 4.93074 | 1.495 |
| 4.93321 | 1.506 |
| 4.93567 | 1.515 |
| 4.938140000000001 | 1.524 |
| 4.9406099999999995 | 1.535 |
| 4.94308 | 1.546 |
| 4.94555 | 1.554 |
| 4.9480200000000005 | 1.562 |
| 4.950489999999999 | 1.581 |
| 4.95296 | 1.598 |
| 4.955430000000001 | 1.605 |
| 4.9578999999999995 | 1.613 |
| 4.96036 | 1.628 |
| 4.96283 | 1.641 |
| 4.9653 | 1.652 |
| 4.967770000000001 | 1.662 |
| 4.9702399999999995 | 1.67 |
| 4.97271 | 1.682 |
| 4.97518 | 1.697 |
| 4.97765 | 1.71 |
| 4.98012 | 1.72 |
| 4.98259 | 1.733 |
| 4.985060000000001 | 1.748 |
| 4.987520000000001 | 1.759 |
| 4.98999 | 1.766 |
| 4.99246 | 1.779 |
| 4.99493 | 1.793 |
| 4.9974 | 1.807 |
| 4.99987 | 1.819 |
| 5.00234 | 1.831 |
| 5.00481 | 1.842 |
| 5.00728 | 1.853 |
| 5.00975 | 1.865 |
| 5.01222 | 1.876 |
| 5.01468 | 1.886 |
| 5.01715 | 1.9 |
| 5.01962 | 1.913 |
| 5.02209 | 1.921 |
| 5.02456 | 1.929 |
| 5.02703 | 1.948 |
| 5.0295 | 1.967 |
| 5.03197 | 1.978 |
| 5.03444 | 1.989 |
| 5.03691 | 2.003 |
| 5.03938 | 2.016 |
| 5.0418400000000005 | 2.029 |
| 5.04431 | 2.043 |
| 5.04678 | 2.052 |
| 5.04925 | 2.061 |
| 5.05172 | 2.076 |
| 5.054189999999999 | 2.091 |
| 5.05666 | 2.105 |
| 5.05913 | 2.12 |
| 5.0616 | 2.135 |
| 5.06407 | 2.15 |
| 5.066529999999999 | 2.157 |
| 5.069 | 2.164 |
| 5.071470000000001 | 2.179 |
| 5.0739399999999995 | 2.195 |
| 5.07641 | 2.206 |
| 5.07888 | 2.218 |
| 5.0813500000000005 | 2.232 |
| 5.083819999999999 | 2.246 |
| 5.08629 | 2.26 |
| 5.088760000000001 | 2.274 |
| 5.0912299999999995 | 2.284 |
| 5.09369 | 2.293 |
| 5.09616 | 2.312 |
| 5.09863 | 2.332 |
| 5.101100000000001 | 2.342 |
| 5.1035699999999995 | 2.351 |
| 5.10604 | 2.367 |
| 5.10851 | 2.384 |
| 5.11098 | 2.396 |
| 5.113449999999999 | 2.408 |
| 5.11592 | 2.423 |
| 5.118390000000001 | 2.438 |
| 5.120850000000001 | 2.453 |
| 5.12332 | 2.468 |
| 5.12579 | 2.48 |
| 5.12826 | 2.491 |
| 5.13073 | 2.507 |
| 5.1331999999999995 | 2.525 |
| 5.13567 | 2.535 |
| 5.13814 | 2.539 |
| 5.14061 | 2.553 |
| 5.14308 | 2.572 |
| 5.14555 | 2.588 |
| 5.14801 | 2.599 |
| 5.15048 | 2.612 |
| 5.15295 | 2.626 |
| 5.15542 | 2.642 |
| 5.15789 | 2.658 |
| 5.16036 | 2.673 |
| 5.16283 | 2.684 |
| 5.1653 | 2.697 |
| 5.167770000000001 | 2.717 |
| 5.17024 | 2.736 |
| 5.17271 | 2.743 |
| 5.1751700000000005 | 2.75 |
| 5.17764 | 2.768 |
| 5.18011 | 2.786 |
| 5.18258 | 2.801 |
| 5.18505 | 2.816 |
| 5.18752 | 2.83 |
| 5.18999 | 2.844 |
| 5.19246 | 2.858 |
| 5.19493 | 2.872 |
| 5.1974 | 2.886 |
| 5.199859999999999 | 2.899 |
| 5.20233 | 2.915 |
| 5.2048000000000005 | 2.934 |
| 5.20727 | 2.949 |
| 5.20974 | 2.958 |
| 5.21221 | 2.97 |
| 5.21468 | 2.988 |
| 5.217149999999999 | 3.005 |
| 5.21962 | 3.018 |
| 5.222090000000001 | 3.032 |
| 5.22456 | 3.048 |
| 5.22702 | 3.064 |
| 5.22949 | 3.077 |
| 5.23196 | 3.09 |
| 5.234430000000001 | 3.105 |
| 5.2368999999999994 | 3.121 |
| 5.23937 | 3.137 |
| 5.24184 | 3.153 |
| 5.2443100000000005 | 3.167 |
| 5.246779999999999 | 3.179 |
| 5.24925 | 3.193 |
| 5.251720000000001 | 3.213 |
| 5.25418 | 3.231 |
| 5.25665 | 3.241 |
| 5.25912 | 3.251 |
| 5.26159 | 3.271 |
| 5.264060000000001 | 3.291 |
| 5.2665299999999995 | 3.306 |
| 5.269 | 3.32 |
| 5.27147 | 3.334 |
| 5.27394 | 3.349 |
| 5.27641 | 3.364 |
| 5.27888 | 3.379 |
| 5.28134 | 3.394 |
| 5.283810000000001 | 3.406 |
| 5.28628 | 3.42 |
| 5.28875 | 3.441 |
| 5.29122 | 3.463 |
| 5.29369 | 3.472 |
| 5.2961599999999995 | 3.48 |
| 5.29863 | 3.498 |
| 5.3011 | 3.518 |
| 5.30357 | 3.534 |
| 5.30603 | 3.548 |
| 5.3085 | 3.564 |
| 5.31097 | 3.581 |
| 5.31344 | 3.599 |
| 5.31591 | 3.616 |
| 5.31838 | 3.633 |
| 5.32085 | 3.644 |
| 5.32332 | 3.654 |
| 5.32579 | 3.671 |
| 5.32826 | 3.69 |
| 5.33073 | 3.705 |
| 5.333189999999999 | 3.718 |
| 5.33566 | 3.733 |
| 5.3381300000000005 | 3.752 |
| 5.3406 | 3.771 |
| 5.34307 | 3.787 |
| 5.34554 | 3.804 |
| 5.34801 | 3.821 |
| 5.350479999999999 | 3.838 |
| 5.35295 | 3.851 |
| 5.3554200000000005 | 3.861 |
| 5.35789 | 3.875 |
| 5.36035 | 3.893 |
| 5.36282 | 3.911 |
| 5.36529 | 3.931 |
| 5.3677600000000005 | 3.952 |
| 5.370229999999999 | 3.964 |
| 5.3727 | 3.975 |
| 5.37517 | 3.992 |
| 5.37764 | 4.013 |
| 5.380109999999999 | 4.029 |
| 5.38258 | 4.04 |
| 5.385050000000001 | 4.052 |
| 5.38751 | 4.072 |
| 5.3899799999999995 | 4.092 |
| 5.39245 | 4.107 |
| 5.39492 | 4.122 |
| 5.397390000000001 | 4.138 |
| 5.399859999999999 | 4.155 |
| 5.40233 | 4.171 |
| 5.4048 | 4.187 |
| 5.4072700000000005 | 4.202 |
| 5.40974 | 4.214 |
| 5.41221 | 4.226 |
| 5.41467 | 4.249 |
| 5.417140000000001 | 4.276 |
| 5.41961 | 4.291 |
| 5.42208 | 4.295 |
| 5.42455 | 4.302 |
| 5.427020000000001 | 4.322 |
| 5.4294899999999995 | 4.342 |
| 5.43196 | 4.359 |
| 5.43443 | 4.376 |
| 5.4369 | 4.394 |
| 5.43936 | 4.413 |
| 5.4418299999999995 | 4.431 |
| 5.4443 | 4.448 |
| 5.446770000000001 | 4.466 |
| 5.44924 | 4.478 |
| 5.45171 | 4.49 |
| 5.45418 | 4.51 |
| 5.45665 | 4.536 |
| 5.4591199999999995 | 4.556 |
| 5.46159 | 4.563 |
| 5.464060000000001 | 4.57 |
| 5.46652 | 4.587 |
| 5.46899 | 4.605 |
| 5.47146 | 4.622 |
| 5.47393 | 4.64 |
| 5.4764 | 4.657 |
| 5.47887 | 4.673 |
| 5.48134 | 4.689 |
| 5.48381 | 4.708 |
| 5.48628 | 4.727 |
| 5.48875 | 4.744 |
| 5.49122 | 4.76 |
| 5.49368 | 4.776 |
| 5.496149999999999 | 4.796 |
| 5.49862 | 4.816 |
| 5.5010900000000005 | 4.83 |
| 5.50356 | 4.844 |
| 5.50603 | 4.86 |
| 5.5085 | 4.88 |
| 5.51097 | 4.899 |
| 5.513439999999999 | 4.914 |
| 5.51591 | 4.928 |
| 5.5183800000000005 | 4.947 |
| 5.52084 | 4.967 |
| 5.52331 | 4.985 |
| 5.52578 | 5 |
| 5.52825 | 5.015 |
| 5.5307200000000005 | 5.029 |
| 5.533189999999999 | 5.044 |
| 5.53566 | 5.063 |
| 5.53813 | 5.085 |
| 5.5406 | 5.105 |
| 5.543069999999999 | 5.119 |
| 5.545529999999999 | 5.132 |
| 5.548 | 5.149 |
| 5.550470000000001 | 5.166 |
| 5.5529399999999995 | 5.182 |
| 5.55541 | 5.198 |
| 5.55788 | 5.213 |
| 5.560350000000001 | 5.233 |
| 5.562819999999999 | 5.252 |
| 5.56529 | 5.269 |
| 5.56776 | 5.284 |
| 5.57023 | 5.299 |
| 5.57269 | 5.317 |
| 5.5751599999999994 | 5.335 |
| 5.57763 | 5.351 |
| 5.580100000000001 | 5.365 |
| 5.58257 | 5.38 |
| 5.58504 | 5.396 |
| 5.58751 | 5.411 |
| 5.58998 | 5.435 |
| 5.5924499999999995 | 5.46 |
| 5.59492 | 5.478 |
| 5.597390000000001 | 5.488 |
| 5.59985 | 5.497 |
| 5.60232 | 5.518 |
| 5.60479 | 5.538 |
| 5.60726 | 5.556 |
| 5.60973 | 5.573 |
| 5.6122 | 5.589 |
| 5.61467 | 5.607 |
| 5.61714 | 5.624 |
| 5.61961 | 5.642 |
| 5.6220799999999995 | 5.662 |
| 5.62455 | 5.68 |
| 5.62701 | 5.695 |
| 5.629479999999999 | 5.71 |
| 5.63195 | 5.73 |
| 5.63442 | 5.752 |
| 5.63689 | 5.771 |
| 5.63936 | 5.779 |
| 5.64183 | 5.787 |
| 5.6443 | 5.805 |
| 5.64677 | 5.828 |
| 5.64924 | 5.849 |
| 5.6517 | 5.868 |
| 5.65417 | 5.887 |
| 5.65664 | 5.903 |
| 5.65911 | 5.918 |
| 5.66158 | 5.934 |
| 5.6640500000000005 | 5.952 |
| 5.66652 | 5.971 |
| 5.66899 | 5.989 |
| 5.67146 | 6.008 |
| 5.67393 | 6.026 |
| 5.676399999999999 | 6.04 |
| 5.678859999999999 | 6.054 |
| 5.68133 | 6.072 |
| 5.6838 | 6.091 |
| 5.68627 | 6.111 |
| 5.68874 | 6.131 |
| 5.69121 | 6.152 |
| 5.6936800000000005 | 6.165 |
| 5.696149999999999 | 6.174 |
| 5.69862 | 6.186 |
| 5.70109 | 6.214 |
| 5.70356 | 6.242 |
| 5.7060200000000005 | 6.261 |
| 5.708489999999999 | 6.274 |
| 5.71096 | 6.286 |
| 5.713430000000001 | 6.297 |
| 5.7158999999999995 | 6.309 |
| 5.71837 | 6.326 |
| 5.72084 | 6.349 |
| 5.723310000000001 | 6.371 |
| 5.725779999999999 | 6.386 |
| 5.72825 | 6.401 |
| 5.73072 | 6.418 |
| 5.73318 | 6.439 |
| 5.73565 | 6.461 |
| 5.73812 | 6.477 |
| 5.74059 | 6.492 |
| 5.743060000000001 | 6.508 |
| 5.74553 | 6.528 |
| 5.748 | 6.548 |
| 5.75047 | 6.56 |
| 5.75294 | 6.567 |
| 5.7554099999999995 | 6.576 |
| 5.75788 | 6.604 |
| 5.76034 | 6.633 |
| 5.76281 | 6.653 |
| 5.76528 | 6.664 |
| 5.76775 | 6.675 |
| 5.77022 | 6.683 |
| 5.77269 | 6.69 |
| 5.77516 | 6.704 |
| 5.77763 | 6.735 |
| 5.7801 | 6.766 |
| 5.78257 | 6.782 |
| 5.78503 | 6.792 |
| 5.7875 | 6.802 |
| 5.78997 | 6.83 |
| 5.79244 | 6.857 |
| 5.79491 | 6.879 |
| 5.79738 | 6.893 |
| 5.79985 | 6.907 |
| 5.80232 | 6.921 |
| 5.80479 | 6.935 |
| 5.80726 | 6.951 |
| 5.809729999999999 | 6.976 |
| 5.812189999999999 | 7.001 |
| 5.81466 | 7.018 |
| 5.81713 | 7.029 |
| 5.8196 | 7.039 |
| 5.82207 | 7.055 |
| 5.82454 | 7.071 |
| 5.8270100000000005 | 7.087 |
| 5.829479999999999 | 7.102 |
| 5.83195 | 7.117 |
| 5.83442 | 7.138 |
| 5.83689 | 7.163 |
| 5.8393500000000005 | 7.188 |
| 5.841819999999999 | 7.201 |
| 5.84429 | 7.214 |
| 5.846760000000001 | 7.229 |
| 5.8492299999999995 | 7.251 |
| 5.8517 | 7.272 |
| 5.85417 | 7.293 |
| 5.8566400000000005 | 7.314 |
| 5.859109999999999 | 7.334 |
| 5.86158 | 7.34 |
| 5.86405 | 7.343 |
| 5.86651 | 7.353 |
| 5.86898 | 7.382 |
| 5.871449999999999 | 7.411 |
| 5.87392 | 7.437 |
| 5.876390000000001 | 7.461 |
| 5.8788599999999995 | 7.485 |
| 5.88133 | 7.486 |
| 5.8838 | 7.482 |
| 5.886270000000001 | 7.483 |
| 5.888739999999999 | 7.51 |
| 5.8911999999999995 | 7.537 |
| 5.89367 | 7.564 |
| 5.89614 | 7.589 |
| 5.89861 | 7.614 |
| 5.90108 | 7.627 |
| 5.90355 | 7.634 |
| 5.906020000000001 | 7.642 |
| 5.90849 | 7.67 |
| 5.91096 | 7.699 |
| 5.91343 | 7.722 |
| 5.9159 | 7.733 |
| 5.91836 | 7.744 |
| 5.92083 | 7.759 |
| 5.9233 | 7.776 |
| 5.925770000000001 | 7.794 |
| 5.92824 | 7.826 |
| 5.93071 | 7.861 |
| 5.93318 | 7.893 |
| 5.93565 | 7.874 |
| 5.93812 | 7.856 |
| 5.94059 | 7.855 |
| 5.94306 | 7.891 |
| 5.94552 | 7.928 |
| 5.94799 | 7.953 |
| 5.95046 | 7.968 |
| 5.95293 | 7.983 |
| 5.9554 | 8.005 |
| 5.95787 | 8.027 |
| 5.96034 | 8.05 |
| 5.96281 | 8.07 |
| 5.96528 | 8.089 |
| 5.96775 | 8.106 |
| 5.97022 | 8.114 |
| 5.97268 | 8.122 |
| 5.975149999999999 | 8.141 |
| 5.97762 | 8.172 |
| 5.980090000000001 | 8.203 |
| 5.98256 | 8.221 |
| 5.98503 | 8.234 |
| 5.9875 | 8.246 |
| 5.9899700000000005 | 8.262 |
| 5.992439999999999 | 8.278 |
| 5.99491 | 8.295 |
| 5.99737 | 8.313 |
| 5.99984 | 8.331 |
| 6.0023100000000005 | 8.351 |
| 6.004779999999999 | 8.376 |
| 6.00725 | 8.401 |
| 6.009720000000001 | 8.421 |
| 6.0121899999999995 | 8.433 |
| 6.01466 | 8.444 |
| 6.01713 | 8.46 |
| 6.0196000000000005 | 8.479 |
| 6.022069999999999 | 8.497 |
| 6.0245299999999995 | 8.522 |
| 6.027 | 8.548 |
| 6.02947 | 8.574 |
| 6.03194 | 8.586 |
| 6.03441 | 8.597 |
| 6.03688 | 8.61 |
| 6.039350000000001 | 8.641 |
| 6.0418199999999995 | 8.672 |
| 6.04429 | 8.689 |
| 6.04676 | 8.666 |
| 6.04923 | 8.642 |
| 6.05169 | 8.647 |
| 6.0541599999999995 | 8.693 |
| 6.05663 | 8.739 |
| 6.0591 | 8.775 |
| 6.06157 | 8.802 |
| 6.06404 | 8.828 |
| 6.06651 | 8.845 |
| 6.06898 | 8.856 |
| 6.07145 | 8.867 |
| 6.07392 | 8.885 |
| 6.07639 | 8.904 |
| 6.07885 | 8.923 |
| 6.08132 | 8.942 |
| 6.08379 | 8.961 |
| 6.08626 | 8.98 |
| 6.08873 | 9.006 |
| 6.0912 | 9.032 |
| 6.09367 | 9.057 |
| 6.09614 | 9.069 |
| 6.09861 | 9.081 |
| 6.10108 | 9.096 |
| 6.10355 | 9.121 |
| 6.10601 | 9.145 |
| 6.108479999999999 | 9.165 |
| 6.11095 | 9.174 |
| 6.11342 | 9.183 |
| 6.11589 | 9.195 |
| 6.11836 | 9.21 |
| 6.12083 | 9.225 |
| 6.1233 | 9.244 |
| 6.12577 | 9.266 |
| 6.12824 | 9.289 |
| 6.1307 | 9.306 |
| 6.13317 | 9.318 |
| 6.13564 | 9.331 |
| 6.138109999999999 | 9.345 |
| 6.14058 | 9.361 |
| 6.143050000000001 | 9.377 |
| 6.14552 | 9.385 |
| 6.14799 | 9.39 |
| 6.15046 | 9.395 |
| 6.1529300000000005 | 9.409 |
| 6.155399999999999 | 9.429 |
| 6.1578599999999994 | 9.448 |
| 6.16033 | 9.454 |
| 6.1628 | 9.455 |
| 6.1652700000000005 | 9.457 |
| 6.16774 | 9.471 |
| 6.17021 | 9.49 |
| 6.172680000000001 | 9.509 |
| 6.1751499999999995 | 9.526 |
| 6.17762 | 9.543 |
| 6.18009 | 9.559 |
| 6.1825600000000005 | 9.553 |
| 6.185020000000001 | 9.542 |
| 6.1874899999999995 | 9.531 |
| 6.18996 | 9.551 |
| 6.19243 | 9.577 |
| 6.1949 | 9.604 |
| 6.19737 | 9.615 |
| 6.19984 | 9.624 |
| 6.202310000000001 | 9.633 |
| 6.2047799999999995 | 9.648 |
| 6.20725 | 9.665 |
| 6.20972 | 9.683 |
| 6.21218 | 9.692 |
| 6.21465 | 9.701 |
| 6.2171199999999995 | 9.709 |
| 6.21959 | 9.725 |
| 6.222060000000001 | 9.742 |
| 6.22453 | 9.759 |
| 6.227 | 9.774 |
| 6.22947 | 9.789 |
| 6.23194 | 9.804 |
| 6.23441 | 9.814 |
| 6.23687 | 9.823 |
| 6.23934 | 9.832 |
| 6.24181 | 9.85 |
| 6.24428 | 9.871 |
| 6.24675 | 9.893 |
| 6.24922 | 9.907 |
| 6.25169 | 9.918 |
| 6.25416 | 9.928 |
| 6.25663 | 9.946 |
| 6.2591 | 9.968 |
| 6.26157 | 9.99 |
| 6.26403 | 10.006 |
| 6.2665 | 10.018 |
| 6.26897 | 10.03 |
| 6.271439999999999 | 10.046 |
| 6.27391 | 10.067 |
| 6.2763800000000005 | 10.087 |
| 6.27885 | 10.105 |
| 6.28132 | 10.118 |
| 6.28379 | 10.131 |
| 6.28626 | 10.144 |
| 6.288729999999999 | 10.159 |
| 6.291189999999999 | 10.173 |
| 6.29366 | 10.19 |
| 6.29613 | 10.214 |
| 6.2986 | 10.238 |
| 6.301069999999999 | 10.259 |
| 6.30354 | 10.27 |
| 6.306010000000001 | 10.281 |
| 6.308479999999999 | 10.293 |
| 6.31095 | 10.316 |
| 6.31342 | 10.339 |
| 6.3158900000000004 | 10.363 |
| 6.318350000000001 | 10.374 |
| 6.320819999999999 | 10.384 |
| 6.32329 | 10.395 |
| 6.32576 | 10.414 |
| 6.32823 | 10.434 |
| 6.3307 | 10.455 |
| 6.33317 | 10.473 |
| 6.335640000000001 | 10.49 |
| 6.3381099999999995 | 10.508 |
| 6.34058 | 10.519 |
| 6.34305 | 10.525 |
| 6.34551 | 10.531 |
| 6.34798 | 10.544 |
| 6.3504499999999995 | 10.567 |
| 6.35292 | 10.59 |
| 6.355390000000001 | 10.613 |
| 6.35786 | 10.633 |
| 6.36033 | 10.654 |
| 6.3628 | 10.674 |
| 6.365270000000001 | 10.696 |
| 6.3677399999999995 | 10.717 |
| 6.3702 | 10.739 |
| 6.37267 | 10.742 |
| 6.37514 | 10.745 |
| 6.37761 | 10.747 |
| 6.3800799999999995 | 10.77 |
| 6.38255 | 10.799 |
| 6.385020000000001 | 10.828 |
| 6.38749 | 10.845 |
| 6.38996 | 10.855 |
| 6.39243 | 10.864 |
| 6.3949 | 10.878 |
| 6.39736 | 10.899 |
| 6.39983 | 10.919 |
| 6.4023 | 10.943 |
| 6.40477 | 10.978 |
| 6.40724 | 11.013 |
| 6.4097100000000005 | 11.049 |
| 6.41218 | 10.976 |
| 6.41465 | 10.903 |
| 6.41712 | 10.83 |
| 6.41959 | 10.876 |
| 6.42206 | 10.956 |
| 6.42452 | 11.036 |
| 6.42699 | 11.08 |
| 6.42946 | 11.096 |
| 6.43193 | 11.113 |
| 6.434399999999999 | 11.13 |
| 6.43687 | 11.15 |
| 6.4393400000000005 | 11.17 |
| 6.44181 | 11.189 |
| 6.44428 | 11.205 |
| 6.44675 | 11.22 |
| 6.44922 | 11.236 |
| 6.4516800000000005 | 11.248 |
| 6.454149999999999 | 11.26 |
| 6.45662 | 11.271 |
| 6.45909 | 11.289 |
| 6.46156 | 11.311 |
| 6.46403 | 11.334 |
| 6.4665 | 11.353 |
| 6.4689700000000006 | 11.365 |
| 6.471439999999999 | 11.377 |
| 6.47391 | 11.389 |
| 6.47637 | 11.403 |
| 6.47884 | 11.416 |
| 6.481310000000001 | 11.43 |
| 6.483779999999999 | 11.449 |
| 6.48625 | 11.47 |
| 6.48872 | 11.491 |
| 6.49119 | 11.503 |
| 6.49366 | 11.507 |
| 6.49613 | 11.511 |
| 6.498600000000001 | 11.519 |
| 6.5010699999999995 | 11.538 |
| 6.50353 | 11.558 |
| 6.506 | 11.578 |
| 6.50847 | 11.605 |
| 6.51094 | 11.634 |
| 6.5134099999999995 | 11.662 |
| 6.51588 | 11.676 |
| 6.518350000000001 | 11.679 |
| 6.52082 | 11.683 |
| 6.52329 | 11.691 |
| 6.52576 | 11.709 |
| 6.52823 | 11.728 |
| 6.53069 | 11.746 |
| 6.53316 | 11.77 |
| 6.53563 | 11.794 |
| 6.5381 | 11.818 |
| 6.54057 | 11.832 |
| 6.5430399999999995 | 11.841 |
| 6.54551 | 11.849 |
| 6.54798 | 11.861 |
| 6.55045 | 11.882 |
| 6.55292 | 11.902 |
| 6.55539 | 11.923 |
| 6.55785 | 11.937 |
| 6.56032 | 11.95 |
| 6.56279 | 11.963 |
| 6.56526 | 11.978 |
| 6.567729999999999 | 11.993 |
| 6.5702 | 12.009 |
| 6.5726700000000005 | 12.025 |
| 6.57514 | 12.038 |
| 6.57761 | 12.051 |
| 6.58008 | 12.065 |
| 6.58254 | 12.085 |
| 6.5850100000000005 | 12.108 |
| 6.587479999999999 | 12.13 |
| 6.58995 | 12.148 |
| 6.59242 | 12.158 |
| 6.59489 | 12.169 |
| 6.59736 | 12.18 |
| 6.59983 | 12.201 |
| 6.6023000000000005 | 12.222 |
| 6.60477 | 12.244 |
| 6.60724 | 12.266 |
| 6.6097 | 12.288 |
| 6.61217 | 12.311 |
| 6.6146400000000005 | 12.33 |
| 6.617109999999999 | 12.334 |
| 6.61958 | 12.338 |
| 6.62205 | 12.343 |
| 6.62452 | 12.372 |
| 6.62699 | 12.407 |
| 6.62946 | 12.443 |
| 6.6319300000000005 | 12.456 |
| 6.634399999999999 | 12.43 |
| 6.6368599999999995 | 12.404 |
| 6.63933 | 12.379 |
| 6.6418 | 12.412 |
| 6.644270000000001 | 12.45 |
| 6.646739999999999 | 12.488 |
| 6.64921 | 12.521 |
| 6.651680000000001 | 12.549 |
| 6.65415 | 12.578 |
| 6.65662 | 12.606 |
| 6.65909 | 12.618 |
| 6.661560000000001 | 12.631 |
| 6.664020000000001 | 12.643 |
| 6.66649 | 12.661 |
| 6.66896 | 12.683 |
| 6.67143 | 12.705 |
| 6.6739 | 12.725 |
| 6.6763699999999995 | 12.726 |
| 6.67884 | 12.726 |
| 6.681310000000001 | 12.727 |
| 6.68378 | 12.742 |
| 6.68625 | 12.766 |
| 6.68872 | 12.791 |
| 6.69118 | 12.815 |
| 6.69365 | 12.834 |
| 6.69612 | 12.854 |
| 6.69859 | 12.874 |
| 6.70106 | 12.891 |
| 6.70353 | 12.907 |
| 6.706 | 12.922 |
| 6.70847 | 12.937 |
| 6.71094 | 12.946 |
| 6.71341 | 12.954 |
| 6.71587 | 12.963 |
| 6.71834 | 12.976 |
| 6.72081 | 12.993 |
| 6.72328 | 13.01 |
| 6.72575 | 13.027 |
| 6.72822 | 13.048 |
| 6.730689999999999 | 13.068 |
| 6.73316 | 13.089 |
| 6.7356300000000005 | 13.106 |
| 6.7381 | 13.12 |
| 6.74057 | 13.135 |
| 6.74303 | 13.149 |
| 6.7455 | 13.168 |
| 6.7479700000000005 | 13.188 |
| 6.750439999999999 | 13.207 |
| 6.75291 | 13.223 |
| 6.75538 | 13.235 |
| 6.75785 | 13.247 |
| 6.76032 | 13.258 |
| 6.76279 | 13.28 |
| 6.7652600000000005 | 13.303 |
| 6.767729999999999 | 13.326 |
| 6.7701899999999995 | 13.346 |
| 6.77266 | 13.354 |
| 6.77513 | 13.362 |
| 6.7776000000000005 | 13.371 |
| 6.780069999999999 | 13.382 |
| 6.78254 | 13.395 |
| 6.785010000000001 | 13.408 |
| 6.7874799999999995 | 13.421 |
| 6.78995 | 13.434 |
| 6.79242 | 13.447 |
| 6.7948900000000005 | 13.46 |
| 6.797350000000001 | 13.474 |
| 6.7998199999999995 | 13.491 |
| 6.80229 | 13.508 |
| 6.80476 | 13.525 |
| 6.80723 | 13.55 |
| 6.809699999999999 | 13.576 |
| 6.81217 | 13.602 |
| 6.814640000000001 | 13.622 |
| 6.81711 | 13.626 |
| 6.81958 | 13.63 |
| 6.82204 | 13.634 |
| 6.82451 | 13.647 |
| 6.82698 | 13.665 |
| 6.82945 | 13.683 |
| 6.83192 | 13.701 |
| 6.83439 | 13.715 |
| 6.83686 | 13.728 |
| 6.83933 | 13.742 |
| 6.8418 | 13.757 |
| 6.844270000000001 | 13.777 |
| 6.84674 | 13.796 |
| 6.8492 | 13.815 |
| 6.85167 | 13.832 |
| 6.85414 | 13.848 |
| 6.85661 | 13.864 |
| 6.85908 | 13.88 |
| 6.86155 | 13.879 |
| 6.86402 | 13.878 |
| 6.86649 | 13.877 |
| 6.86896 | 13.886 |
| 6.87143 | 13.915 |
| 6.8739 | 13.945 |
| 6.87636 | 13.974 |
| 6.87883 | 13.993 |
| 6.8813 | 14.005 |
| 6.88377 | 14.017 |
| 6.88624 | 14.029 |
| 6.88871 | 14.05 |
| 6.89118 | 14.072 |
| 6.89365 | 14.093 |
| 6.89612 | 14.112 |
| 6.89859 | 14.121 |
| 6.90106 | 14.129 |
| 6.90352 | 14.138 |
| 6.90599 | 14.15 |
| 6.90846 | 14.167 |
| 6.9109300000000005 | 14.183 |
| 6.913399999999999 | 14.199 |
| 6.91587 | 14.217 |
| 6.91834 | 14.236 |
| 6.92081 | 14.254 |
| 6.92328 | 14.272 |
| 6.92575 | 14.283 |
| 6.9282200000000005 | 14.294 |
| 6.930680000000001 | 14.305 |
| 6.9331499999999995 | 14.318 |
| 6.93562 | 14.335 |
| 6.93809 | 14.352 |
| 6.9405600000000005 | 14.37 |
| 6.943029999999999 | 14.385 |
| 6.9455 | 14.398 |
| 6.947970000000001 | 14.412 |
| 6.9504399999999995 | 14.425 |
| 6.95291 | 14.44 |
| 6.95537 | 14.456 |
| 6.95784 | 14.472 |
| 6.960310000000001 | 14.488 |
| 6.9627799999999995 | 14.493 |
| 6.96525 | 14.499 |
| 6.96772 | 14.504 |
| 6.97019 | 14.512 |
| 6.972659999999999 | 14.536 |
| 6.97513 | 14.558 |
| 6.977600000000001 | 14.582 |
| 6.9800699999999996 | 14.601 |
| 6.98253 | 14.615 |
| 6.985 | 14.629 |
| 6.98747 | 14.642 |
| 6.98994 | 14.653 |
| 6.99241 | 14.662 |
| 6.99488 | 14.67 |
| 6.99735 | 14.679 |
| 6.99982 | 14.695 |
| 7.00229 | 14.714 |
| 7.00476 | 14.733 |
| 7.00723 | 14.751 |
| 7.00969 | 14.766 |
| 7.01216 | 14.781 |
| 7.01463 | 14.795 |
| 7.0171 | 14.81 |
| 7.01957 | 14.823 |
| 7.02204 | 14.837 |
| 7.02451 | 14.851 |
| 7.02698 | 14.864 |
| 7.02945 | 14.875 |
| 7.03192 | 14.885 |
| 7.03439 | 14.896 |
| 7.03685 | 14.91 |
| 7.03932 | 14.93 |
| 7.04179 | 14.949 |
| 7.04426 | 14.969 |
| 7.046729999999999 | 14.978 |
| 7.0492 | 14.977 |
| 7.05167 | 14.977 |
| 7.05414 | 14.976 |
| 7.05661 | 14.991 |
| 7.05908 | 15.015 |
| 7.06154 | 15.039 |
| 7.064010000000001 | 15.062 |
| 7.066479999999999 | 15.082 |
| 7.06895 | 15.1 |
| 7.07142 | 15.118 |
| 7.0738900000000005 | 15.135 |
| 7.076359999999999 | 15.145 |
| 7.07883 | 15.153 |
| 7.081300000000001 | 15.161 |
| 7.08377 | 15.169 |
| 7.08624 | 15.186 |
| 7.0887 | 15.204 |
| 7.09117 | 15.221 |
| 7.093640000000001 | 15.239 |
| 7.0961099999999995 | 15.251 |
| 7.09858 | 15.262 |
| 7.10105 | 15.274 |
| 7.1035200000000005 | 15.286 |
| 7.105989999999999 | 15.309 |
| 7.10846 | 15.331 |
| 7.110930000000001 | 15.354 |
| 7.1133999999999995 | 15.374 |
| 7.11586 | 15.378 |
| 7.11833 | 15.383 |
| 7.1208 | 15.387 |
| 7.123270000000001 | 15.393 |
| 7.1257399999999995 | 15.414 |
| 7.12821 | 15.434 |
| 7.13068 | 15.454 |
| 7.13315 | 15.474 |
| 7.13562 | 15.489 |
| 7.13809 | 15.504 |
| 7.140560000000001 | 15.52 |
| 7.143020000000001 | 15.533 |
| 7.14549 | 15.54 |
| 7.14796 | 15.546 |
| 7.15043 | 15.553 |
| 7.1529 | 15.562 |
| 7.15537 | 15.584 |
| 7.15784 | 15.605 |
| 7.160310000000001 | 15.627 |
| 7.16278 | 15.644 |
| 7.16525 | 15.648 |
| 7.1677100000000005 | 15.652 |
| 7.17018 | 15.655 |
| 7.17265 | 15.663 |
| 7.17512 | 15.685 |
| 7.17759 | 15.707 |
| 7.18006 | 15.73 |
| 7.18253 | 15.75 |
| 7.185 | 15.765 |
| 7.18747 | 15.779 |
| 7.18994 | 15.793 |
| 7.19241 | 15.807 |
| 7.19487 | 15.825 |
| 7.1973400000000005 | 15.842 |
| 7.19981 | 15.859 |
| 7.20228 | 15.876 |
| 7.20475 | 15.885 |
| 7.20722 | 15.894 |
| 7.209689999999999 | 15.903 |
| 7.21216 | 15.912 |
| 7.2146300000000005 | 15.925 |
| 7.2171 | 15.938 |
| 7.21957 | 15.951 |
| 7.22203 | 15.965 |
| 7.2245 | 15.983 |
| 7.226970000000001 | 16.002 |
| 7.229439999999999 | 16.02 |
| 7.23191 | 16.039 |
| 7.23438 | 16.049 |
| 7.2368500000000004 | 16.057 |
| 7.239319999999999 | 16.066 |
| 7.24179 | 16.074 |
| 7.244260000000001 | 16.093 |
| 7.2467299999999994 | 16.113 |
| 7.24919 | 16.133 |
| 7.25166 | 16.154 |
| 7.25413 | 16.167 |
| 7.256600000000001 | 16.177 |
| 7.2590699999999995 | 16.187 |
| 7.26154 | 16.197 |
| 7.26401 | 16.211 |
| 7.26648 | 16.229 |
| 7.26895 | 16.246 |
| 7.27142 | 16.263 |
| 7.273890000000001 | 16.275 |
| 7.276350000000001 | 16.281 |
| 7.27882 | 16.286 |
| 7.28129 | 16.292 |
| 7.28376 | 16.301 |
| 7.28623 | 16.319 |
| 7.2886999999999995 | 16.337 |
| 7.29117 | 16.355 |
| 7.29364 | 16.372 |
| 7.29611 | 16.389 |
| 7.29858 | 16.407 |
| 7.3010399999999995 | 16.424 |
| 7.30351 | 16.44 |
| 7.30598 | 16.447 |
| 7.30845 | 16.453 |
| 7.31092 | 16.46 |
| 7.31339 | 16.466 |
| 7.31586 | 16.487 |
| 7.31833 | 16.511 |
| 7.3208 | 16.535 |
| 7.323270000000001 | 16.559 |
| 7.32574 | 16.569 |
| 7.3282 | 16.572 |
| 7.3306700000000005 | 16.575 |
| 7.33314 | 16.578 |
| 7.33561 | 16.587 |
| 7.33808 | 16.602 |
| 7.34055 | 16.617 |
| 7.34302 | 16.633 |
| 7.34549 | 16.648 |
| 7.34796 | 16.662 |
| 7.35043 | 16.676 |
| 7.3529 | 16.691 |
| 7.355359999999999 | 16.705 |
| 7.35783 | 16.719 |
| 7.3603000000000005 | 16.733 |
| 7.36277 | 16.747 |
| 7.36524 | 16.76 |
| 7.36771 | 16.774 |
| 7.37018 | 16.788 |
| 7.372649999999999 | 16.802 |
| 7.37512 | 16.815 |
| 7.3775900000000005 | 16.826 |
| 7.38006 | 16.836 |
| 7.38252 | 16.845 |
| 7.38499 | 16.855 |
| 7.38746 | 16.867 |
| 7.3899300000000006 | 16.886 |
| 7.392399999999999 | 16.905 |
| 7.39487 | 16.924 |
| 7.39734 | 16.943 |
| 7.39981 | 16.95 |
| 7.402279999999999 | 16.957 |
| 7.40475 | 16.963 |
| 7.40721 | 16.97 |
| 7.409680000000001 | 16.986 |
| 7.41215 | 17.005 |
| 7.41462 | 17.024 |
| 7.41709 | 17.043 |
| 7.419560000000001 | 17.057 |
| 7.4220299999999995 | 17.068 |
| 7.4245 | 17.079 |
| 7.42697 | 17.089 |
| 7.42944 | 17.1 |
| 7.43191 | 17.114 |
| 7.4343699999999995 | 17.129 |
| 7.43684 | 17.143 |
| 7.439310000000001 | 17.157 |
| 7.44178 | 17.17 |
| 7.44425 | 17.183 |
| 7.44672 | 17.196 |
| 7.44919 | 17.209 |
| 7.4516599999999995 | 17.22 |
| 7.45413 | 17.23 |
| 7.456600000000001 | 17.239 |
| 7.45907 | 17.248 |
| 7.46153 | 17.259 |
| 7.464 | 17.275 |
| 7.46647 | 17.292 |
| 7.46894 | 17.308 |
| 7.47141 | 17.324 |
| 7.47388 | 17.334 |
| 7.47635 | 17.342 |
| 7.47882 | 17.35 |
| 7.4812899999999996 | 17.358 |
| 7.48376 | 17.371 |
| 7.48623 | 17.391 |
| 7.488689999999999 | 17.411 |
| 7.49116 | 17.432 |
| 7.4936300000000005 | 17.451 |
| 7.4961 | 17.46 |
| 7.49857 | 17.469 |
| 7.50104 | 17.479 |
| 7.50351 | 17.488 |
| 7.505979999999999 | 17.501 |
| 7.50845 | 17.517 |
| 7.5109200000000005 | 17.532 |
| 7.51338 | 17.548 |
| 7.51585 | 17.562 |
| 7.51832 | 17.572 |
| 7.52079 | 17.582 |
| 7.5232600000000005 | 17.592 |
| 7.525729999999999 | 17.602 |
| 7.5282 | 17.612 |
| 7.53067 | 17.621 |
| 7.53314 | 17.631 |
| 7.535609999999999 | 17.64 |
| 7.53808 | 17.653 |
| 7.54054 | 17.668 |
| 7.543010000000001 | 17.683 |
| 7.5454799999999995 | 17.699 |
| 7.54795 | 17.714 |
| 7.55042 | 17.723 |
| 7.5528900000000005 | 17.731 |
| 7.555359999999999 | 17.739 |
| 7.55783 | 17.748 |
| 7.5603 | 17.761 |
| 7.56277 | 17.779 |
| 7.56524 | 17.797 |
| 7.567699999999999 | 17.815 |
| 7.57017 | 17.832 |
| 7.572640000000001 | 17.838 |
| 7.57511 | 17.845 |
| 7.57758 | 17.852 |
| 7.58005 | 17.858 |
| 7.582520000000001 | 17.87 |
| 7.5849899999999995 | 17.887 |
| 7.58746 | 17.903 |
| 7.589930000000001 | 17.919 |
| 7.5924 | 17.935 |
| 7.59486 | 17.946 |
| 7.59733 | 17.957 |
| 7.5998 | 17.967 |
| 7.602270000000001 | 17.978 |
| 7.60474 | 17.991 |
| 7.60721 | 18.005 |
| 7.60968 | 18.02 |
| 7.61215 | 18.034 |
| 7.6146199999999995 | 18.048 |
| 7.61709 | 18.063 |
| 7.619560000000001 | 18.079 |
| 7.62202 | 18.094 |
| 7.62449 | 18.109 |
| 7.62696 | 18.121 |
| 7.62943 | 18.131 |
| 7.6319 | 18.14 |
| 7.63437 | 18.15 |
| 7.63684 | 18.16 |
| 7.63931 | 18.178 |
| 7.64178 | 18.197 |
| 7.64425 | 18.215 |
| 7.64671 | 18.234 |
| 7.64918 | 18.247 |
| 7.65165 | 18.253 |
| 7.65412 | 18.258 |
| 7.6565900000000005 | 18.264 |
| 7.65906 | 18.269 |
| 7.66153 | 18.287 |
| 7.664 | 18.306 |
| 7.66647 | 18.326 |
| 7.668939999999999 | 18.346 |
| 7.67141 | 18.364 |
| 7.67387 | 18.373 |
| 7.67634 | 18.383 |
| 7.67881 | 18.393 |
| 7.68128 | 18.403 |
| 7.68375 | 18.415 |
| 7.6862200000000005 | 18.427 |
| 7.688689999999999 | 18.44 |
| 7.69116 | 18.452 |
| 7.69363 | 18.465 |
| 7.6961 | 18.479 |
| 7.69857 | 18.494 |
| 7.701029999999999 | 18.508 |
| 7.7035 | 18.522 |
| 7.705970000000001 | 18.534 |
| 7.7084399999999995 | 18.543 |
| 7.71091 | 18.551 |
| 7.71338 | 18.56 |
| 7.7158500000000005 | 18.568 |
| 7.718319999999999 | 18.584 |
| 7.72079 | 18.602 |
| 7.72326 | 18.619 |
| 7.7257299999999995 | 18.637 |
| 7.72819 | 18.654 |
| 7.730659999999999 | 18.661 |
| 7.73313 | 18.668 |
| 7.735600000000001 | 18.675 |
| 7.73807 | 18.682 |
| 7.74054 | 18.693 |
| 7.74301 | 18.709 |
| 7.74548 | 18.726 |
| 7.7479499999999994 | 18.742 |
| 7.75042 | 18.759 |
| 7.75288 | 18.768 |
| 7.75535 | 18.775 |
| 7.75782 | 18.783 |
| 7.76029 | 18.79 |
| 7.76276 | 18.797 |
| 7.76523 | 18.811 |
| 7.7677 | 18.825 |
| 7.77017 | 18.839 |
| 7.77264 | 18.854 |
| 7.77511 | 18.867 |
| 7.7775799999999995 | 18.88 |
| 7.78004 | 18.894 |
| 7.78251 | 18.906 |
| 7.784979999999999 | 18.919 |
| 7.78745 | 18.93 |
| 7.78992 | 18.94 |
| 7.79239 | 18.949 |
| 7.79486 | 18.958 |
| 7.79733 | 18.967 |
| 7.7998 | 18.983 |
| 7.80227 | 19 |
| 7.80474 | 19.017 |
| 7.8072 | 19.034 |
| 7.80967 | 19.05 |
| 7.81214 | 19.058 |
| 7.81461 | 19.067 |
| 7.81708 | 19.076 |
| 7.8195500000000004 | 19.085 |
| 7.82202 | 19.096 |
| 7.82449 | 19.111 |
| 7.82696 | 19.127 |
| 7.82943 | 19.143 |
| 7.831899999999999 | 19.159 |
| 7.834359999999999 | 19.168 |
| 7.83683 | 19.173 |
| 7.839300000000001 | 19.177 |
| 7.84177 | 19.182 |
| 7.84424 | 19.186 |
| 7.84671 | 19.199 |
| 7.8491800000000005 | 19.215 |
| 7.851649999999999 | 19.231 |
| 7.85412 | 19.247 |
| 7.85659 | 19.264 |
| 7.85906 | 19.275 |
| 7.8615200000000005 | 19.287 |
| 7.863989999999999 | 19.298 |
| 7.86646 | 19.309 |
| 7.868930000000001 | 19.32 |
| 7.8713999999999995 | 19.331 |
| 7.87387 | 19.342 |
| 7.87634 | 19.353 |
| 7.8788100000000005 | 19.364 |
| 7.881279999999999 | 19.376 |
| 7.88375 | 19.391 |
| 7.88621 | 19.406 |
| 7.88868 | 19.421 |
| 7.89115 | 19.436 |
| 7.89362 | 19.448 |
| 7.89609 | 19.455 |
| 7.898560000000001 | 19.462 |
| 7.9010299999999996 | 19.468 |
| 7.9035 | 19.475 |
| 7.90597 | 19.488 |
| 7.90844 | 19.507 |
| 7.910909999999999 | 19.525 |
| 7.91337 | 19.544 |
| 7.91584 | 19.563 |
| 7.91831 | 19.573 |
| 7.92078 | 19.58 |
| 7.92325 | 19.586 |
| 7.92572 | 19.592 |
| 7.92819 | 19.598 |
| 7.93066 | 19.613 |
| 7.93313 | 19.63 |
| 7.9356 | 19.647 |
| 7.93807 | 19.664 |
| 7.94053 | 19.681 |
| 7.943 | 19.693 |
| 7.94547 | 19.704 |
| 7.94794 | 19.715 |
| 7.95041 | 19.726 |
| 7.95288 | 19.737 |
| 7.95535 | 19.749 |
| 7.95782 | 19.762 |
| 7.96029 | 19.774 |
| 7.96276 | 19.787 |
| 7.965229999999999 | 19.799 |
| 7.967689999999999 | 19.814 |
| 7.97016 | 19.829 |
| 7.9726300000000005 | 19.844 |
| 7.9751 | 19.859 |
| 7.97757 | 19.874 |
| 7.98004 | 19.88 |
| 7.98251 | 19.887 |
| 7.984979999999999 | 19.894 |
| 7.98745 | 19.9 |
| 7.98992 | 19.907 |
| 7.99238 | 19.925 |
| 7.9948500000000005 | 19.942 |
| 7.997319999999999 | 19.959 |
| 7.99979 | 19.977 |